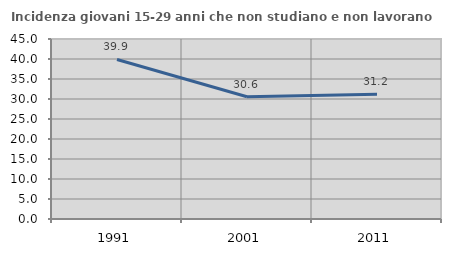
| Category | Incidenza giovani 15-29 anni che non studiano e non lavorano  |
|---|---|
| 1991.0 | 39.886 |
| 2001.0 | 30.579 |
| 2011.0 | 31.179 |